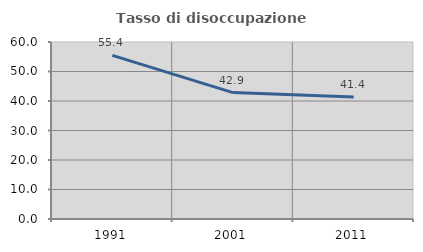
| Category | Tasso di disoccupazione giovanile  |
|---|---|
| 1991.0 | 55.446 |
| 2001.0 | 42.857 |
| 2011.0 | 41.379 |